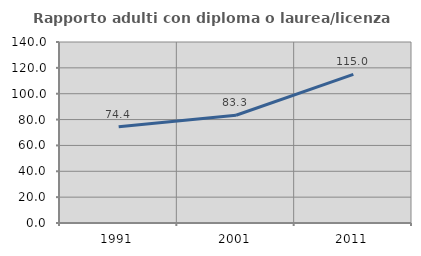
| Category | Rapporto adulti con diploma o laurea/licenza media  |
|---|---|
| 1991.0 | 74.359 |
| 2001.0 | 83.333 |
| 2011.0 | 114.976 |